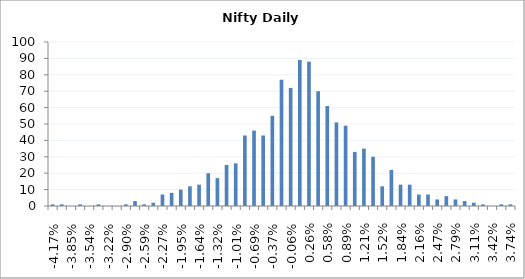
| Category | Series 0 |
|---|---|
| -0.041688861480017714 | 1 |
| -0.04010749027255482 | 1 |
| -0.03852611906509193 | 0 |
| -0.03694474785762904 | 1 |
| -0.035363376650166145 | 0 |
| -0.03378200544270325 | 1 |
| -0.03220063423524036 | 0 |
| -0.03061926302777747 | 0 |
| -0.029037891820314576 | 1 |
| -0.027456520612851684 | 3 |
| -0.025875149405388792 | 1 |
| -0.0242937781979259 | 2 |
| -0.022712406990463008 | 7 |
| -0.021131035783000116 | 8 |
| -0.019549664575537223 | 10 |
| -0.01796829336807433 | 12 |
| -0.01638692216061144 | 13 |
| -0.014805550953148547 | 20 |
| -0.013224179745685655 | 17 |
| -0.011642808538222763 | 25 |
| -0.01006143733075987 | 26 |
| -0.008480066123296978 | 43 |
| -0.006898694915834085 | 46 |
| -0.005317323708371192 | 43 |
| -0.003735952500908299 | 55 |
| -0.002154581293445406 | 77 |
| -0.0005732100859825132 | 72 |
| 0.0010081611214803796 | 89 |
| 0.0025895323289432722 | 88 |
| 0.004170903536406165 | 70 |
| 0.005752274743869058 | 61 |
| 0.007333645951331951 | 51 |
| 0.008915017158794844 | 49 |
| 0.010496388366257737 | 33 |
| 0.012077759573720629 | 35 |
| 0.013659130781183521 | 30 |
| 0.015240501988646413 | 12 |
| 0.016821873196109307 | 22 |
| 0.0184032444035722 | 13 |
| 0.01998461561103509 | 13 |
| 0.021565986818497983 | 7 |
| 0.023147358025960876 | 7 |
| 0.024728729233423768 | 4 |
| 0.02631010044088666 | 6 |
| 0.027891471648349552 | 4 |
| 0.029472842855812444 | 3 |
| 0.031054214063275336 | 2 |
| 0.03263558527073823 | 1 |
| 0.034216956478201124 | 0 |
| 0.035798327685664016 | 1 |
| 0.03737969889312691 | 1 |